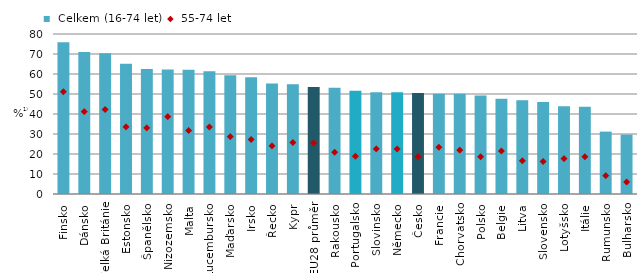
| Category |  Celkem (16-74 let) |
|---|---|
| Finsko | 75.93 |
| Dánsko | 70.996 |
| Velká Británie | 70.427 |
| Estonsko | 65.116 |
| Španělsko | 62.507 |
| Nizozemsko | 62.246 |
| Malta | 62.07 |
| Lucembursko | 61.378 |
| Maďarsko | 59.366 |
| Irsko | 58.376 |
| Řecko | 55.197 |
| Kypr | 54.886 |
| EU28 průměr | 53.472 |
| Rakousko | 53.103 |
| Portugalsko | 51.568 |
| Slovinsko | 50.864 |
| Německo | 50.835 |
| Česko | 50.535 |
| Francie | 50.087 |
| Chorvatsko | 50.086 |
| Polsko | 49.189 |
| Belgie | 47.595 |
| Litva | 46.83 |
| Slovensko | 46.028 |
| Lotyšsko | 43.907 |
| Itálie | 43.656 |
| Rumunsko | 31.199 |
| Bulharsko | 29.711 |